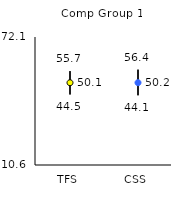
| Category | 25th | 75th | Mean |
|---|---|---|---|
| TFS | 44.5 | 55.7 | 50.13 |
| CSS | 44.1 | 56.4 | 50.16 |